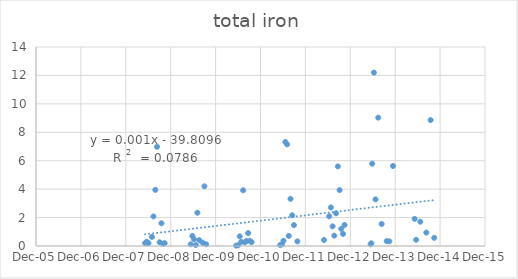
| Category | Series 0 |
|---|---|
| 39577.0 | 0.2 |
| 39590.0 | 0.3 |
| 39604.0 | 0.2 |
| 39633.0 | 0.64 |
| 39645.0 | 2.08 |
| 39660.0 | 3.95 |
| 39674.0 | 6.98 |
| 39695.0 | 0.26 |
| 39710.0 | 1.6 |
| 39723.0 | 0.15 |
| 39736.0 | 0.2 |
| 39947.0 | 0.12 |
| 39961.0 | 0.71 |
| 39974.0 | 0.48 |
| 39989.0 | 0.07 |
| 40002.0 | 2.34 |
| 40017.0 | 0.41 |
| 40045.0 | 0.234 |
| 40059.0 | 4.2 |
| 40073.0 | 0.124 |
| 40317.0 | 0.03 |
| 40332.0 | 0.048 |
| 40346.0 | 0.678 |
| 40359.0 | 0.294 |
| 40374.0 | 3.92 |
| 40388.0 | 0.265 |
| 40402.0 | 0.358 |
| 40415.0 | 0.908 |
| 40429.0 | 0.355 |
| 40443.0 | 0.273 |
| 40675.0 | 0.07 |
| 40689.0 | 0.117 |
| 40702.0 | 0.368 |
| 40717.0 | 7.32 |
| 40731.0 | 7.15 |
| 40745.0 | 0.707 |
| 40759.0 | 3.32 |
| 40773.0 | 2.16 |
| 40787.0 | 1.47 |
| 40815.0 | 0.325 |
| 41031.0 | 0.424 |
| 41073.0 | 2.09 |
| 41087.0 | 2.71 |
| 41101.0 | 1.38 |
| 41115.0 | 0.73 |
| 41129.0 | 2.3 |
| 41144.0 | 5.6 |
| 41158.0 | 3.93 |
| 41171.0 | 1.21 |
| 41186.0 | 0.851 |
| 41198.0 | 1.48 |
| 41410.0 | 0.116 |
| 41416.0 | 0.191 |
| 41423.0 | 5.79 |
| 41437.0 | 12.2 |
| 41450.0 | 3.28 |
| 41472.0 | 9.03 |
| 41500.0 | 1.55 |
| 41541.0 | 0.345 |
| 41563.0 | 0.327 |
| 41592.0 | 5.63 |
| 41768.0 | 1.91 |
| 41780.0 | 0.438 |
| 41814.0 | 1.71 |
| 41863.0 | 0.945 |
| 41898.0 | 8.86 |
| 41927.0 | 0.575 |